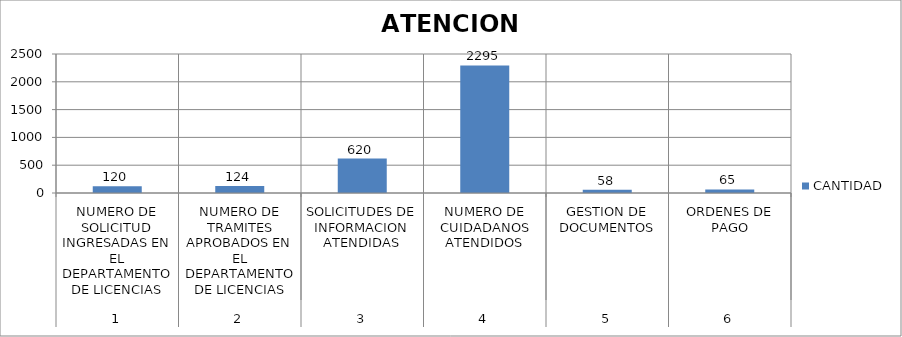
| Category | CANTIDAD |
|---|---|
| 0 | 120 |
| 1 | 124 |
| 2 | 620 |
| 3 | 2295 |
| 4 | 58 |
| 5 | 65 |